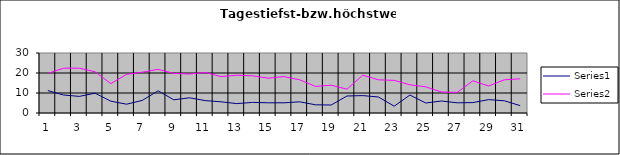
| Category | Series 0 | Series 1 |
|---|---|---|
| 0 | 11.2 | 19.8 |
| 1 | 9 | 22.4 |
| 2 | 8.3 | 22.4 |
| 3 | 9.9 | 20.6 |
| 4 | 5.9 | 14.7 |
| 5 | 4.4 | 19.3 |
| 6 | 6.3 | 20.4 |
| 7 | 11.1 | 21.8 |
| 8 | 6.6 | 19.8 |
| 9 | 7.6 | 19.5 |
| 10 | 6.2 | 20.3 |
| 11 | 5.6 | 18.2 |
| 12 | 4.7 | 18.9 |
| 13 | 5.3 | 18.6 |
| 14 | 5.1 | 17.4 |
| 15 | 5.1 | 18.2 |
| 16 | 5.6 | 16.6 |
| 17 | 4.1 | 13.3 |
| 18 | 4 | 13.9 |
| 19 | 8.5 | 11.9 |
| 20 | 8.7 | 18.9 |
| 21 | 8 | 16.6 |
| 22 | 3.4 | 16.3 |
| 23 | 9 | 14.1 |
| 24 | 5 | 13.1 |
| 25 | 6 | 10.5 |
| 26 | 5.1 | 10.3 |
| 27 | 5.2 | 16.1 |
| 28 | 6.7 | 13.5 |
| 29 | 6.1 | 16.6 |
| 30 | 3.7 | 17.1 |